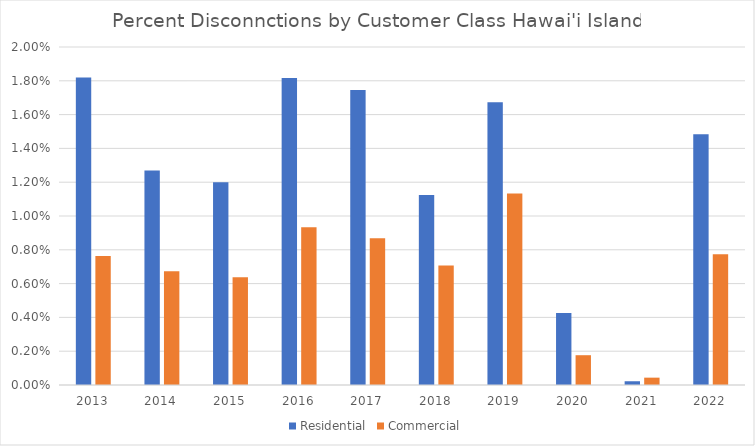
| Category | Residential | Commercial |
|---|---|---|
| 2013.0 | 0.018 | 0.008 |
| 2014.0 | 0.013 | 0.007 |
| 2015.0 | 0.012 | 0.006 |
| 2016.0 | 0.018 | 0.009 |
| 2017.0 | 0.017 | 0.009 |
| 2018.0 | 0.011 | 0.007 |
| 2019.0 | 0.017 | 0.011 |
| 2020.0 | 0.004 | 0.002 |
| 2021.0 | 0 | 0 |
| 2022.0 | 0.015 | 0.008 |